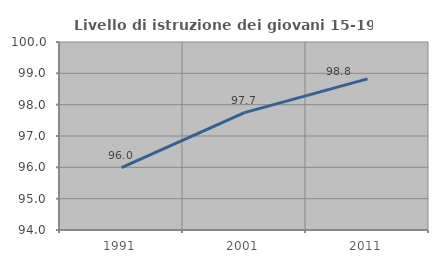
| Category | Livello di istruzione dei giovani 15-19 anni |
|---|---|
| 1991.0 | 95.992 |
| 2001.0 | 97.747 |
| 2011.0 | 98.822 |